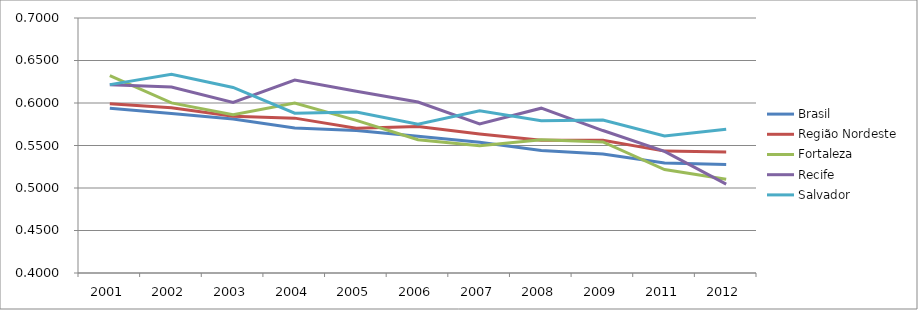
| Category | Brasil | Região Nordeste | Fortaleza | Recife | Salvador |
|---|---|---|---|---|---|
| 2001.0 | 0.594 | 0.599 | 0.632 | 0.622 | 0.622 |
| 2002.0 | 0.588 | 0.594 | 0.6 | 0.619 | 0.634 |
| 2003.0 | 0.581 | 0.584 | 0.586 | 0.601 | 0.618 |
| 2004.0 | 0.57 | 0.582 | 0.6 | 0.627 | 0.588 |
| 2005.0 | 0.568 | 0.57 | 0.58 | 0.614 | 0.589 |
| 2006.0 | 0.561 | 0.572 | 0.557 | 0.601 | 0.575 |
| 2007.0 | 0.554 | 0.564 | 0.55 | 0.575 | 0.591 |
| 2008.0 | 0.544 | 0.556 | 0.557 | 0.594 | 0.579 |
| 2009.0 | 0.54 | 0.556 | 0.554 | 0.568 | 0.58 |
| 2011.0 | 0.529 | 0.543 | 0.522 | 0.543 | 0.561 |
| 2012.0 | 0.528 | 0.542 | 0.51 | 0.505 | 0.569 |